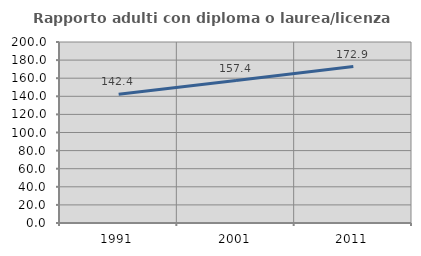
| Category | Rapporto adulti con diploma o laurea/licenza media  |
|---|---|
| 1991.0 | 142.391 |
| 2001.0 | 157.353 |
| 2011.0 | 172.917 |